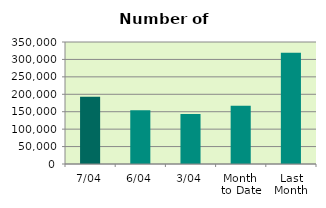
| Category | Series 0 |
|---|---|
| 7/04 | 193204 |
| 6/04 | 154096 |
| 3/04 | 143206 |
| Month 
to Date | 167383.6 |
| Last
Month | 318803.545 |